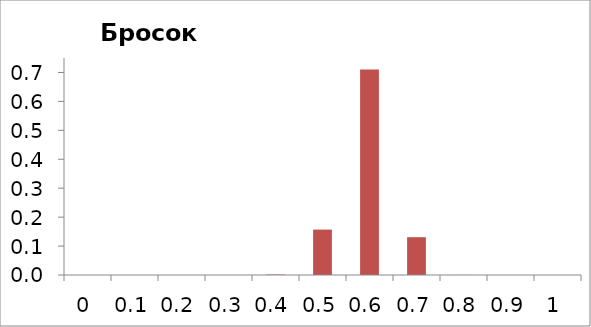
| Category | Series 1 |
|---|---|
| 0.0 | 0 |
| 0.1 | 0 |
| 0.2 | 0 |
| 0.3 | 0 |
| 0.4 | 0.002 |
| 0.5 | 0.157 |
| 0.6 | 0.711 |
| 0.7 | 0.131 |
| 0.8 | 0 |
| 0.9 | 0 |
| 1.0 | 0 |